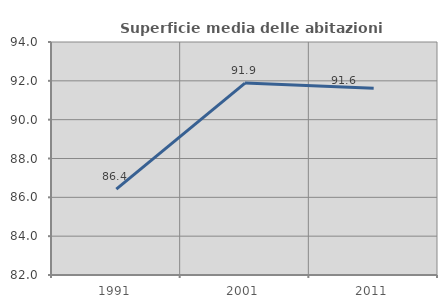
| Category | Superficie media delle abitazioni occupate |
|---|---|
| 1991.0 | 86.421 |
| 2001.0 | 91.884 |
| 2011.0 | 91.617 |